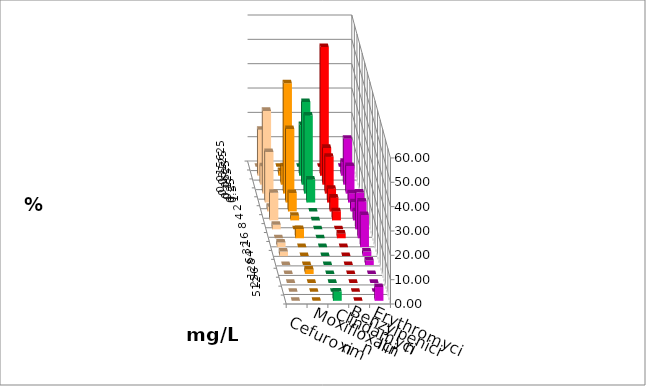
| Category | Cefuroxim | Moxifloxacin | Clindamycin | Benzylpenicillin | Erythromycin |
|---|---|---|---|---|---|
| 0.015625 | 0 | 0 | 0 | 0 | 0 |
| 0.03125 | 18.868 | 1.887 | 20.755 | 52.83 | 5.66 |
| 0.0625 | 7.547 | 7.547 | 33.962 | 15.094 | 18.868 |
| 0.125 | 33.962 | 45.283 | 32.075 | 15.094 | 11.321 |
| 0.25 | 20.755 | 30.189 | 9.434 | 5.66 | 3.774 |
| 0.5 | 1.887 | 7.547 | 0 | 5.66 | 3.774 |
| 1.0 | 11.321 | 1.887 | 0 | 3.774 | 3.774 |
| 2.0 | 1.887 | 0 | 0 | 0 | 15.094 |
| 4.0 | 0 | 3.774 | 0 | 1.887 | 15.094 |
| 8.0 | 1.887 | 0 | 0 | 0 | 13.208 |
| 16.0 | 1.887 | 0 | 0 | 0 | 1.887 |
| 32.0 | 0 | 0 | 0 | 0 | 1.887 |
| 64.0 | 0 | 1.887 | 0 | 0 | 0 |
| 128.0 | 0 | 0 | 0 | 0 | 0 |
| 256.0 | 0 | 0 | 0 | 0 | 0 |
| 512.0 | 0 | 0 | 3.774 | 0 | 5.66 |